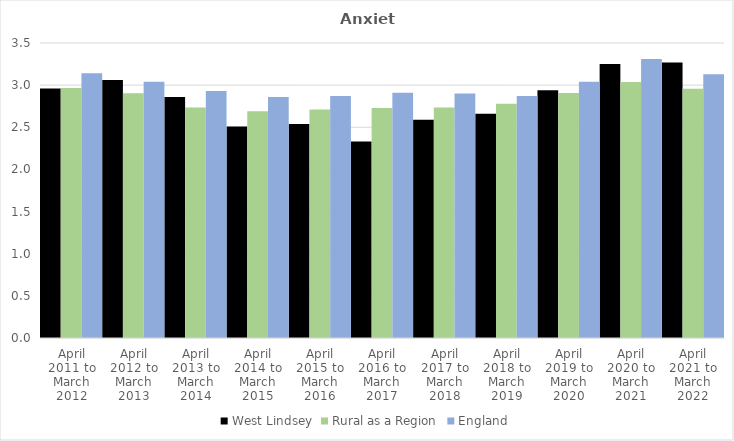
| Category | West Lindsey | Rural as a Region | England |
|---|---|---|---|
| April 2011 to March 2012 | 2.96 | 2.967 | 3.14 |
| April 2012 to March 2013 | 3.06 | 2.904 | 3.04 |
| April 2013 to March 2014 | 2.86 | 2.734 | 2.93 |
| April 2014 to March 2015 | 2.51 | 2.691 | 2.86 |
| April 2015 to March 2016 | 2.54 | 2.711 | 2.87 |
| April 2016 to March 2017 | 2.33 | 2.729 | 2.91 |
| April 2017 to March 2018 | 2.59 | 2.736 | 2.9 |
| April 2018 to March 2019 | 2.66 | 2.78 | 2.87 |
| April 2019 to March 2020 | 2.94 | 2.908 | 3.04 |
| April 2020 to March 2021 | 3.25 | 3.036 | 3.31 |
| April 2021 to March 2022 | 3.27 | 2.956 | 3.13 |